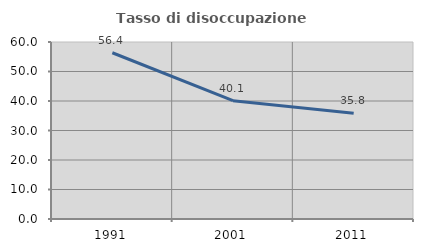
| Category | Tasso di disoccupazione giovanile  |
|---|---|
| 1991.0 | 56.354 |
| 2001.0 | 40.098 |
| 2011.0 | 35.815 |